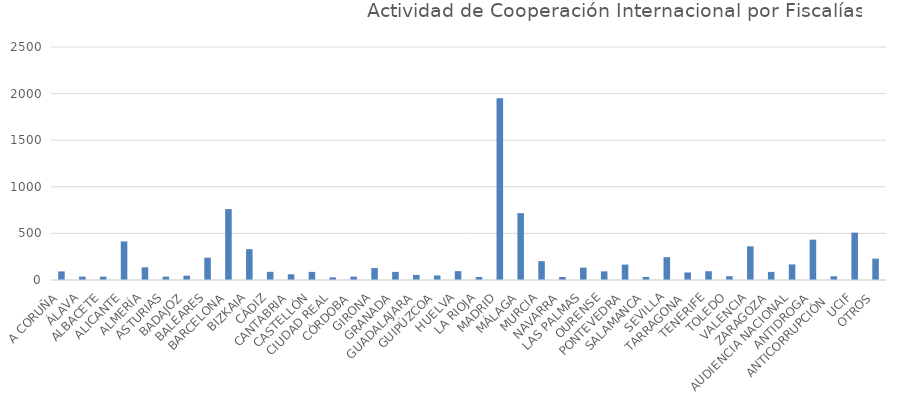
| Category | Nº DE EXPEDIENTES |
|---|---|
| A CORUÑA | 92 |
| ÁLAVA | 36 |
| ALBACETE | 36 |
| ALICANTE | 414 |
| ALMERÍA | 136 |
| ASTURIAS | 36 |
| BADAJOZ | 46 |
| BALEARES | 239 |
| BARCELONA | 761 |
| BIZKAIA | 331 |
| CÁDIZ | 88 |
| CANTABRIA | 61 |
| CASTELLÓN | 87 |
| CIUDAD REAL | 28 |
| CÓRDOBA | 36 |
| GIRONA | 128 |
| GRANADA | 87 |
| GUADALAJARA | 55 |
| GUIPÚZCOA | 49 |
| HUELVA | 95 |
| LA RIOJA | 32 |
| MADRID | 1949 |
| MÁLAGA | 717 |
| MURCIA | 202 |
| NAVARRA | 32 |
| LAS PALMAS | 133 |
| OURENSE | 93 |
| PONTEVEDRA | 165 |
| SALAMANCA | 33 |
| SEVILLA | 245 |
| TARRAGONA | 81 |
| TENERIFE | 94 |
| TOLEDO | 41 |
| VALENCIA | 361 |
| ZARAGOZA | 87 |
| AUDIENCIA NACIONAL | 167 |
| ANTIDROGA | 433 |
| ANTICORRUPCIÓN  | 40 |
| UCIF | 508 |
| OTROS | 229 |